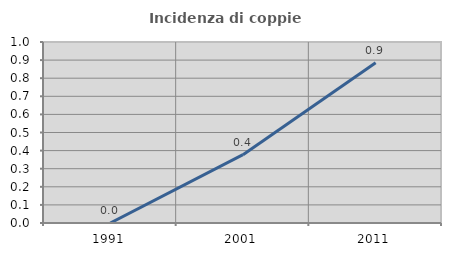
| Category | Incidenza di coppie miste |
|---|---|
| 1991.0 | 0 |
| 2001.0 | 0.378 |
| 2011.0 | 0.886 |